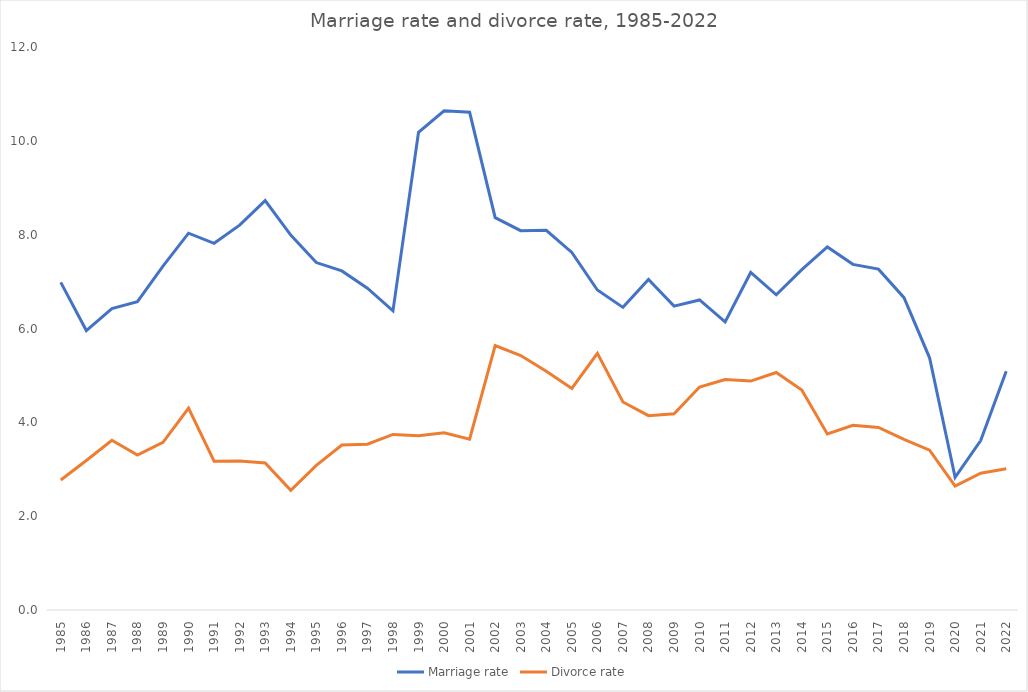
| Category | Marriage rate | Divorce rate |
|---|---|---|
| 1985.0 | 6.982 | 2.77 |
| 1986.0 | 5.957 | 3.187 |
| 1987.0 | 6.423 | 3.617 |
| 1988.0 | 6.573 | 3.303 |
| 1989.0 | 7.329 | 3.574 |
| 1990.0 | 8.031 | 4.303 |
| 1991.0 | 7.815 | 3.172 |
| 1992.0 | 8.202 | 3.174 |
| 1993.0 | 8.726 | 3.135 |
| 1994.0 | 7.99 | 2.552 |
| 1995.0 | 7.406 | 3.083 |
| 1996.0 | 7.227 | 3.517 |
| 1997.0 | 6.86 | 3.534 |
| 1998.0 | 6.376 | 3.742 |
| 1999.0 | 10.183 | 3.714 |
| 2000.0 | 10.642 | 3.775 |
| 2001.0 | 10.608 | 3.642 |
| 2002.0 | 8.363 | 5.637 |
| 2003.0 | 8.086 | 5.423 |
| 2004.0 | 8.093 | 5.087 |
| 2005.0 | 7.62 | 4.722 |
| 2006.0 | 6.821 | 5.473 |
| 2007.0 | 6.45 | 4.433 |
| 2008.0 | 7.045 | 4.142 |
| 2009.0 | 6.476 | 4.183 |
| 2010.0 | 6.609 | 4.753 |
| 2011.0 | 6.141 | 4.913 |
| 2012.0 | 7.194 | 4.879 |
| 2013.0 | 6.719 | 5.063 |
| 2014.0 | 7.256 | 4.691 |
| 2015.0 | 7.738 | 3.753 |
| 2016.0 | 7.367 | 3.936 |
| 2017.0 | 7.265 | 3.89 |
| 2018.0 | 6.657 | 3.636 |
| 2019.0 | 5.375 | 3.407 |
| 2020.0 | 2.827 | 2.643 |
| 2021.0 | 3.612 | 2.915 |
| 2022.0 | 5.088 | 3.01 |